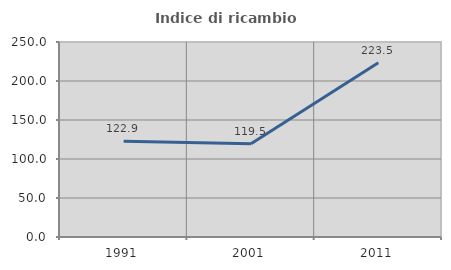
| Category | Indice di ricambio occupazionale  |
|---|---|
| 1991.0 | 122.857 |
| 2001.0 | 119.512 |
| 2011.0 | 223.529 |